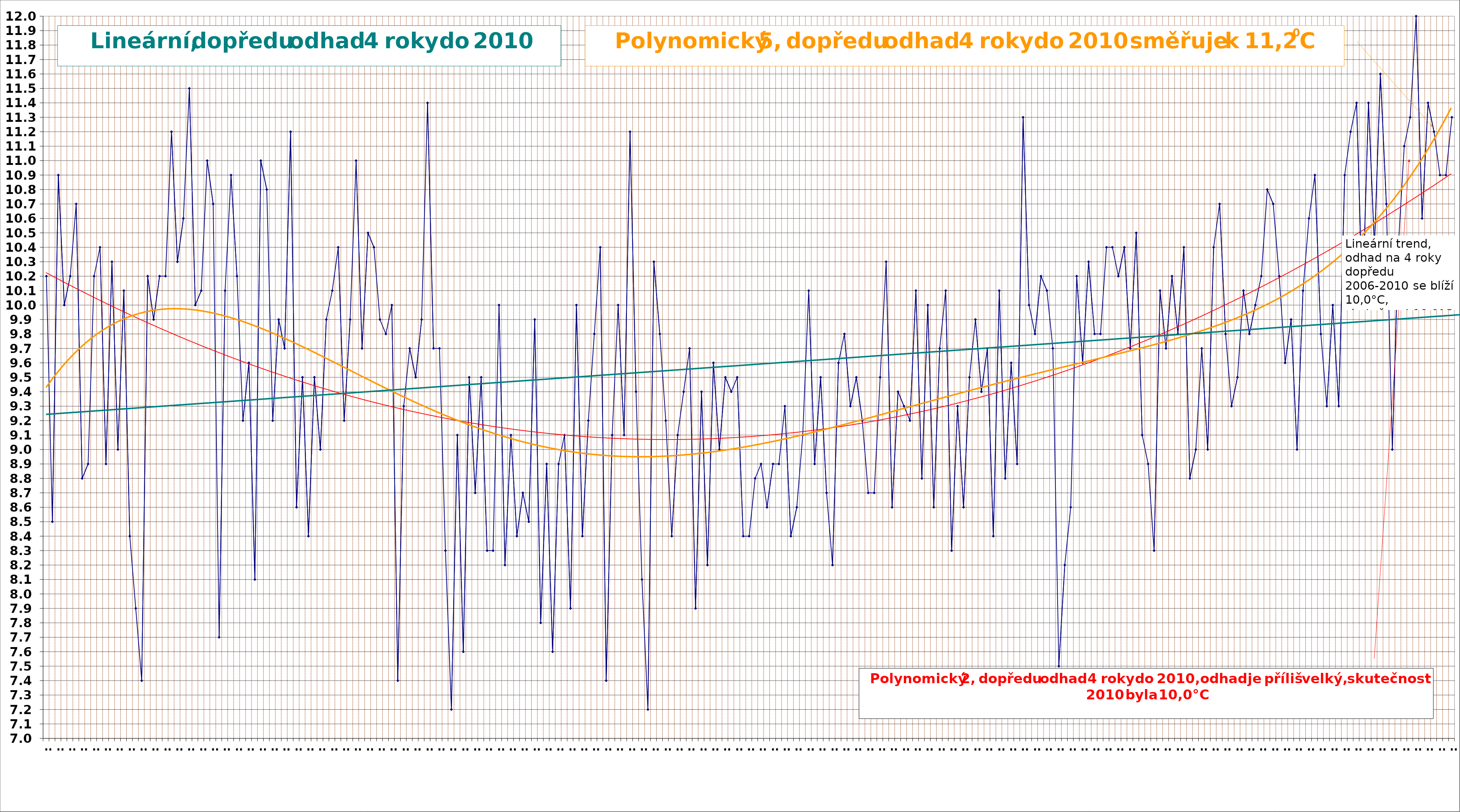
| Category | teplota |
|---|---|
| 1770.0 | 10.2 |
| 1771.0 | 8.5 |
| 1772.0 | 10.9 |
| 1773.0 | 10 |
| 1774.0 | 10.2 |
| 1775.0 | 10.7 |
| 1776.0 | 8.8 |
| 1777.0 | 8.9 |
| 1778.0 | 10.2 |
| 1779.0 | 10.4 |
| 1780.0 | 8.9 |
| 1781.0 | 10.3 |
| 1782.0 | 9 |
| 1783.0 | 10.1 |
| 1784.0 | 8.4 |
| 1785.0 | 7.9 |
| 1786.0 | 7.4 |
| 1787.0 | 10.2 |
| 1788.0 | 9.9 |
| 1789.0 | 10.2 |
| 1790.0 | 10.2 |
| 1791.0 | 11.2 |
| 1792.0 | 10.3 |
| 1793.0 | 10.6 |
| 1794.0 | 11.5 |
| 1795.0 | 10 |
| 1796.0 | 10.1 |
| 1797.0 | 11 |
| 1798.0 | 10.7 |
| 1799.0 | 7.7 |
| 1800.0 | 10.1 |
| 1801.0 | 10.9 |
| 1802.0 | 10.2 |
| 1803.0 | 9.2 |
| 1804.0 | 9.6 |
| 1805.0 | 8.1 |
| 1806.0 | 11 |
| 1807.0 | 10.8 |
| 1808.0 | 9.2 |
| 1809.0 | 9.9 |
| 1810.0 | 9.7 |
| 1811.0 | 11.2 |
| 1812.0 | 8.6 |
| 1813.0 | 9.5 |
| 1814.0 | 8.4 |
| 1815.0 | 9.5 |
| 1816.0 | 9 |
| 1817.0 | 9.9 |
| 1818.0 | 10.1 |
| 1819.0 | 10.4 |
| 1820.0 | 9.2 |
| 1821.0 | 9.9 |
| 1822.0 | 11 |
| 1823.0 | 9.7 |
| 1824.0 | 10.5 |
| 1825.0 | 10.4 |
| 1826.0 | 9.9 |
| 1827.0 | 9.8 |
| 1828.0 | 10 |
| 1829.0 | 7.4 |
| 1830.0 | 9.3 |
| 1831.0 | 9.7 |
| 1832.0 | 9.5 |
| 1833.0 | 9.9 |
| 1834.0 | 11.4 |
| 1835.0 | 9.7 |
| 1836.0 | 9.7 |
| 1837.0 | 8.3 |
| 1838.0 | 7.2 |
| 1839.0 | 9.1 |
| 1840.0 | 7.6 |
| 1841.0 | 9.5 |
| 1842.0 | 8.7 |
| 1843.0 | 9.5 |
| 1844.0 | 8.3 |
| 1845.0 | 8.3 |
| 1846.0 | 10 |
| 1847.0 | 8.2 |
| 1848.0 | 9.1 |
| 1849.0 | 8.4 |
| 1850.0 | 8.7 |
| 1851.0 | 8.5 |
| 1852.0 | 9.9 |
| 1853.0 | 7.8 |
| 1854.0 | 8.9 |
| 1855.0 | 7.6 |
| 1856.0 | 8.9 |
| 1857.0 | 9.1 |
| 1858.0 | 7.9 |
| 1859.0 | 10 |
| 1860.0 | 8.4 |
| 1861.0 | 9.2 |
| 1862.0 | 9.8 |
| 1863.0 | 10.4 |
| 1864.0 | 7.4 |
| 1865.0 | 9.1 |
| 1866.0 | 10 |
| 1867.0 | 9.1 |
| 1868.0 | 11.2 |
| 1869.0 | 9.4 |
| 1870.0 | 8.1 |
| 1871.0 | 7.2 |
| 1872.0 | 10.3 |
| 1873.0 | 9.8 |
| 1874.0 | 9.2 |
| 1875.0 | 8.4 |
| 1876.0 | 9.1 |
| 1877.0 | 9.4 |
| 1878.0 | 9.7 |
| 1879.0 | 7.9 |
| 1880.0 | 9.4 |
| 1881.0 | 8.2 |
| 1882.0 | 9.6 |
| 1883.0 | 9 |
| 1884.0 | 9.5 |
| 1885.0 | 9.4 |
| 1886.0 | 9.5 |
| 1887.0 | 8.4 |
| 1888.0 | 8.4 |
| 1889.0 | 8.8 |
| 1890.0 | 8.9 |
| 1891.0 | 8.6 |
| 1892.0 | 8.9 |
| 1893.0 | 8.9 |
| 1894.0 | 9.3 |
| 1895.0 | 8.4 |
| 1896.0 | 8.6 |
| 1897.0 | 9.1 |
| 1898.0 | 10.1 |
| 1899.0 | 8.9 |
| 1900.0 | 9.5 |
| 1901.0 | 8.7 |
| 1902.0 | 8.2 |
| 1903.0 | 9.6 |
| 1904.0 | 9.8 |
| 1905.0 | 9.3 |
| 1906.0 | 9.5 |
| 1907.0 | 9.2 |
| 1908.0 | 8.7 |
| 1909.0 | 8.7 |
| 1910.0 | 9.5 |
| 1911.0 | 10.3 |
| 1912.0 | 8.6 |
| 1913.0 | 9.4 |
| 1914.0 | 9.3 |
| 1915.0 | 9.2 |
| 1916.0 | 10.1 |
| 1917.0 | 8.8 |
| 1918.0 | 10 |
| 1919.0 | 8.6 |
| 1920.0 | 9.7 |
| 1921.0 | 10.1 |
| 1922.0 | 8.3 |
| 1923.0 | 9.3 |
| 1924.0 | 8.6 |
| 1925.0 | 9.5 |
| 1926.0 | 9.9 |
| 1927.0 | 9.4 |
| 1928.0 | 9.7 |
| 1929.0 | 8.4 |
| 1930.0 | 10.1 |
| 1931.0 | 8.8 |
| 1932.0 | 9.6 |
| 1933.0 | 8.9 |
| 1934.0 | 11.3 |
| 1935.0 | 10 |
| 1936.0 | 9.8 |
| 1937.0 | 10.2 |
| 1938.0 | 10.1 |
| 1939.0 | 9.7 |
| 1940.0 | 7.5 |
| 1941.0 | 8.2 |
| 1942.0 | 8.6 |
| 1943.0 | 10.2 |
| 1944.0 | 9.6 |
| 1945.0 | 10.3 |
| 1946.0 | 9.8 |
| 1947.0 | 9.8 |
| 1948.0 | 10.4 |
| 1949.0 | 10.4 |
| 1950.0 | 10.2 |
| 1951.0 | 10.4 |
| 1952.0 | 9.7 |
| 1953.0 | 10.5 |
| 1954.0 | 9.1 |
| 1955.0 | 8.9 |
| 1956.0 | 8.3 |
| 1957.0 | 10.1 |
| 1958.0 | 9.7 |
| 1959.0 | 10.2 |
| 1960.0 | 9.8 |
| 1961.0 | 10.4 |
| 1962.0 | 8.8 |
| 1963.0 | 9 |
| 1964.0 | 9.7 |
| 1965.0 | 9 |
| 1966.0 | 10.4 |
| 1967.0 | 10.7 |
| 1968.0 | 9.8 |
| 1969.0 | 9.3 |
| 1970.0 | 9.5 |
| 1971.0 | 10.1 |
| 1972.0 | 9.8 |
| 1973.0 | 10 |
| 1974.0 | 10.2 |
| 1975.0 | 10.8 |
| 1976.0 | 10.7 |
| 1977.0 | 10.2 |
| 1978.0 | 9.6 |
| 1979.0 | 9.9 |
| 1980.0 | 9 |
| 1981.0 | 10.1 |
| 1982.0 | 10.6 |
| 1983.0 | 10.9 |
| 1984.0 | 9.8 |
| 1985.0 | 9.3 |
| 1986.0 | 10 |
| 1987.0 | 9.3 |
| 1988.0 | 10.9 |
| 1989.0 | 11.2 |
| 1990.0 | 11.4 |
| 1991.0 | 10 |
| 1992.0 | 11.4 |
| 1993.0 | 10.4 |
| 1994.0 | 11.6 |
| 1995.0 | 10.7 |
| 1996.0 | 9 |
| 1997.0 | 10.4 |
| 1998.0 | 11.1 |
| 1999.0 | 11.3 |
| 2000.0 | 12 |
| 2001.0 | 10.6 |
| 2002.0 | 11.4 |
| 2003.0 | 11.2 |
| 2004.0 | 10.9 |
| 2005.0 | 10.9 |
| 2006.0 | 11.3 |